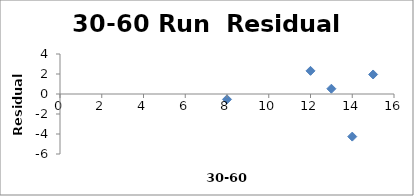
| Category | Series 0 |
|---|---|
| 15.0 | 1.952 |
| 14.0 | -4.26 |
| 13.0 | 0.527 |
| 12.0 | 2.315 |
| 8.0 | -0.534 |